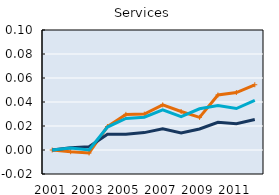
| Category | Gross output (p90) | Employment (p90) | Series 2 |
|---|---|---|---|
| 2001.0 | 0 | 0 | 0 |
| 2002.0 | -0.001 | 0.002 | 0.002 |
| 2003.0 | -0.002 | 0.003 | 0 |
| 2004.0 | 0.019 | 0.013 | 0.019 |
| 2005.0 | 0.03 | 0.013 | 0.026 |
| 2006.0 | 0.03 | 0.015 | 0.027 |
| 2007.0 | 0.038 | 0.018 | 0.034 |
| 2008.0 | 0.032 | 0.014 | 0.028 |
| 2009.0 | 0.027 | 0.018 | 0.034 |
| 2010.0 | 0.046 | 0.023 | 0.037 |
| 2011.0 | 0.048 | 0.022 | 0.035 |
| 2012.0 | 0.054 | 0.025 | 0.041 |